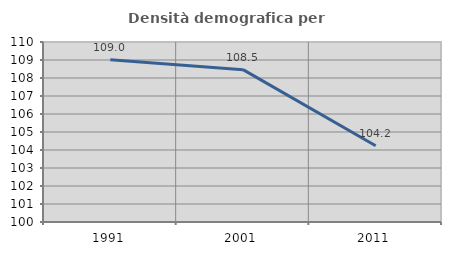
| Category | Densità demografica |
|---|---|
| 1991.0 | 109.017 |
| 2001.0 | 108.465 |
| 2011.0 | 104.232 |